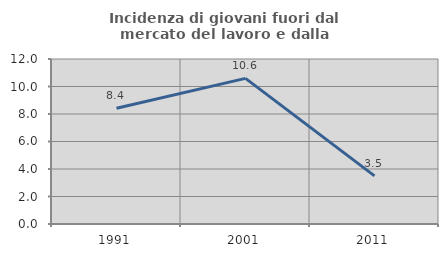
| Category | Incidenza di giovani fuori dal mercato del lavoro e dalla formazione  |
|---|---|
| 1991.0 | 8.416 |
| 2001.0 | 10.588 |
| 2011.0 | 3.497 |